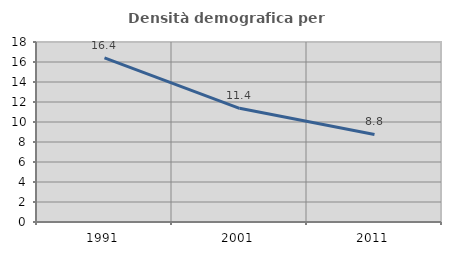
| Category | Densità demografica |
|---|---|
| 1991.0 | 16.42 |
| 2001.0 | 11.368 |
| 2011.0 | 8.751 |